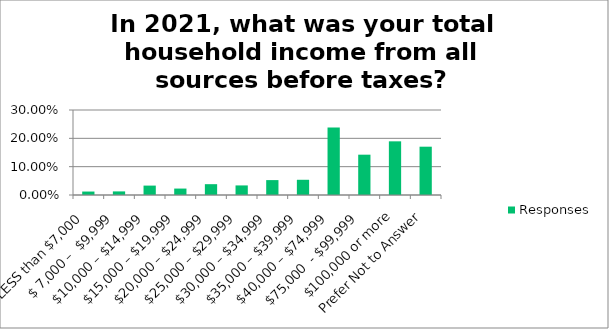
| Category | Responses |
|---|---|
| LESS than $7,000 | 0.012 |
| $ 7,000 –  $9,999 | 0.013 |
| $10,000 – $14,999 | 0.033 |
| $15,000 – $19,999 | 0.023 |
| $20,000 – $24,999 | 0.038 |
| $25,000 – $29,999 | 0.034 |
| $30,000 – $34,999 | 0.053 |
| $35,000 – $39,999 | 0.054 |
| $40,000 – $74,999 | 0.239 |
| $75,000  - $99,999 | 0.142 |
| $100,000 or more | 0.189 |
| Prefer Not to Answer | 0.17 |